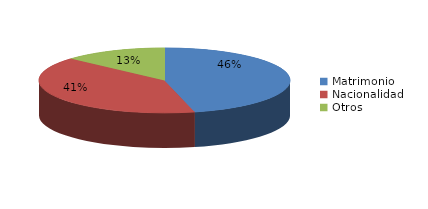
| Category | Series 0 |
|---|---|
| Matrimonio | 551 |
| Nacionalidad | 484 |
| Otros | 159 |